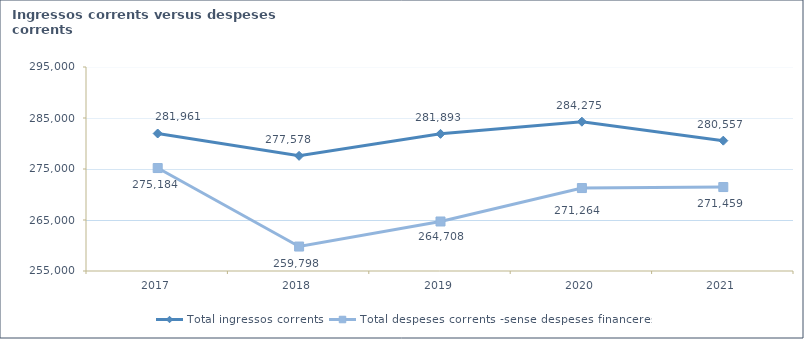
| Category | Total ingressos corrents  | Total despeses corrents -sense despeses financeres- |
|---|---|---|
| 2017 | 281960.645 | 275184.371 |
| 2018 | 277577.74 | 259797.553 |
| 2019 | 281892.556 | 264708.067 |
| 2020 | 284275.226 | 271264.162 |
| 2021 | 280557.499 | 271459.41 |